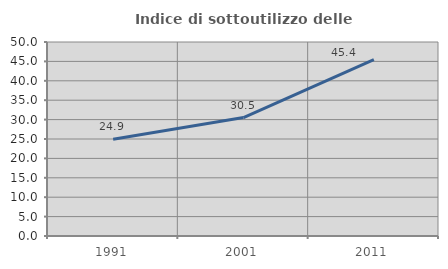
| Category | Indice di sottoutilizzo delle abitazioni  |
|---|---|
| 1991.0 | 24.945 |
| 2001.0 | 30.518 |
| 2011.0 | 45.429 |